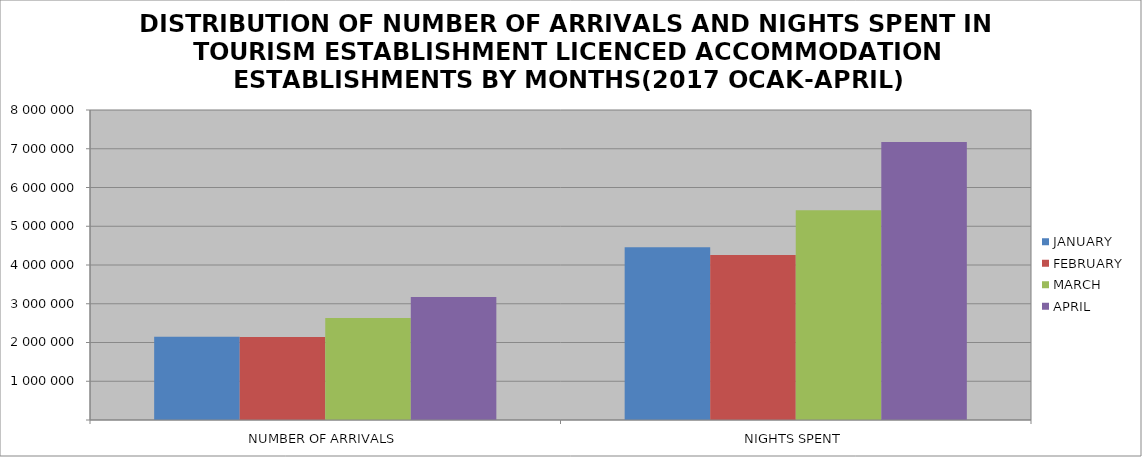
| Category | JANUARY | FEBRUARY | MARCH | APRIL |
|---|---|---|---|---|
| NUMBER OF ARRIVALS | 2146994 | 2141043 | 2629734 | 3173381 |
| NIGHTS SPENT | 4457352 | 4260377 | 5413903 | 7176325 |